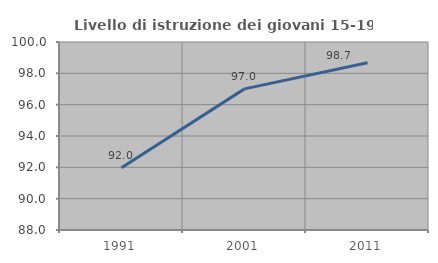
| Category | Livello di istruzione dei giovani 15-19 anni |
|---|---|
| 1991.0 | 91.968 |
| 2001.0 | 97.008 |
| 2011.0 | 98.676 |